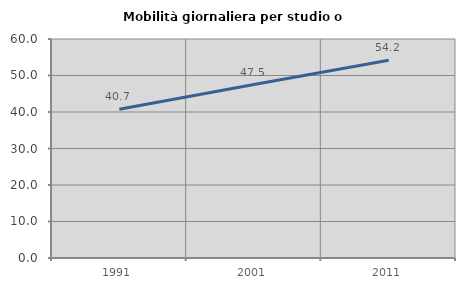
| Category | Mobilità giornaliera per studio o lavoro |
|---|---|
| 1991.0 | 40.746 |
| 2001.0 | 47.524 |
| 2011.0 | 54.186 |